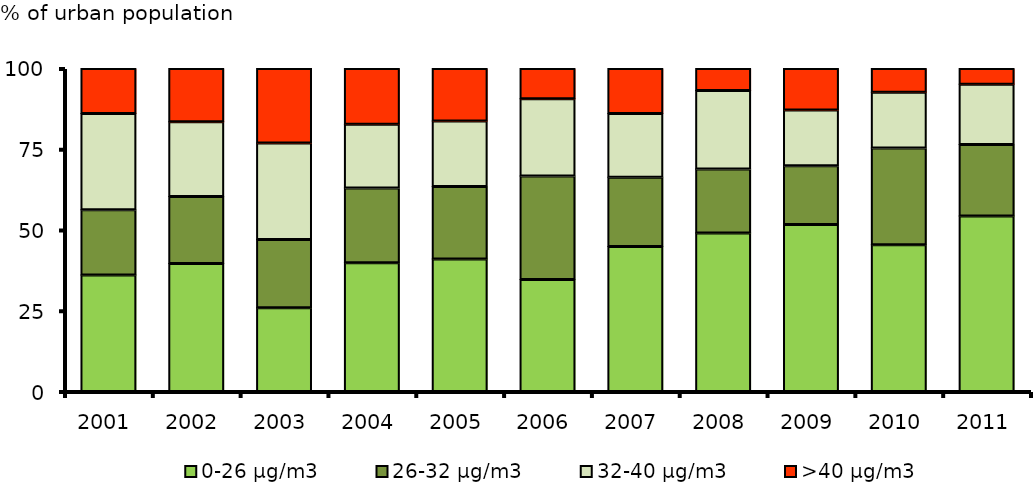
| Category | 0-26 μg/m3 | 26-32 μg/m3 | 32-40 μg/m3 | >40 μg/m3 |
|---|---|---|---|---|
| 2001.0 | 36.102 | 20.146 | 29.854 | 13.897 |
| 2002.0 | 39.636 | 20.773 | 23.114 | 16.477 |
| 2003.0 | 25.932 | 21.15 | 29.858 | 23.06 |
| 2004.0 | 39.883 | 23.083 | 19.799 | 17.235 |
| 2005.0 | 40.989 | 22.501 | 20.265 | 16.244 |
| 2006.0 | 34.637 | 32.1 | 23.868 | 9.395 |
| 2007.0 | 44.86 | 21.433 | 19.761 | 13.946 |
| 2008.0 | 49.081 | 19.77 | 24.353 | 6.796 |
| 2009.0 | 51.713 | 18.205 | 17.222 | 12.86 |
| 2010.0 | 45.4 | 29.967 | 17.248 | 7.385 |
| 2011.0 | 54.329 | 22.142 | 18.621 | 4.907 |